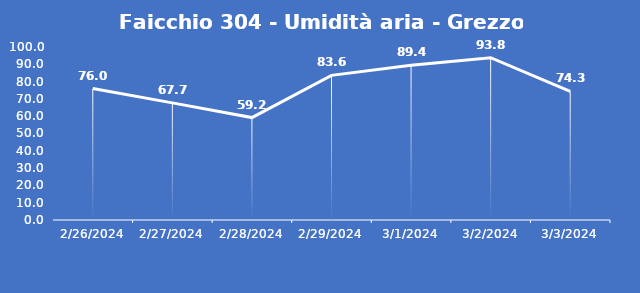
| Category | Faicchio 304 - Umidità aria - Grezzo (%) |
|---|---|
| 2/26/24 | 76 |
| 2/27/24 | 67.7 |
| 2/28/24 | 59.2 |
| 2/29/24 | 83.6 |
| 3/1/24 | 89.4 |
| 3/2/24 | 93.8 |
| 3/3/24 | 74.3 |